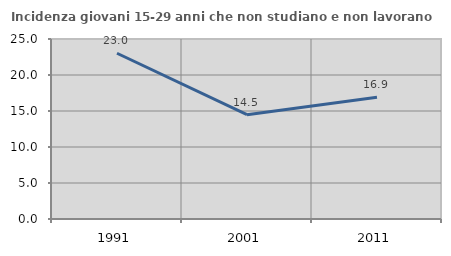
| Category | Incidenza giovani 15-29 anni che non studiano e non lavorano  |
|---|---|
| 1991.0 | 23.022 |
| 2001.0 | 14.493 |
| 2011.0 | 16.923 |